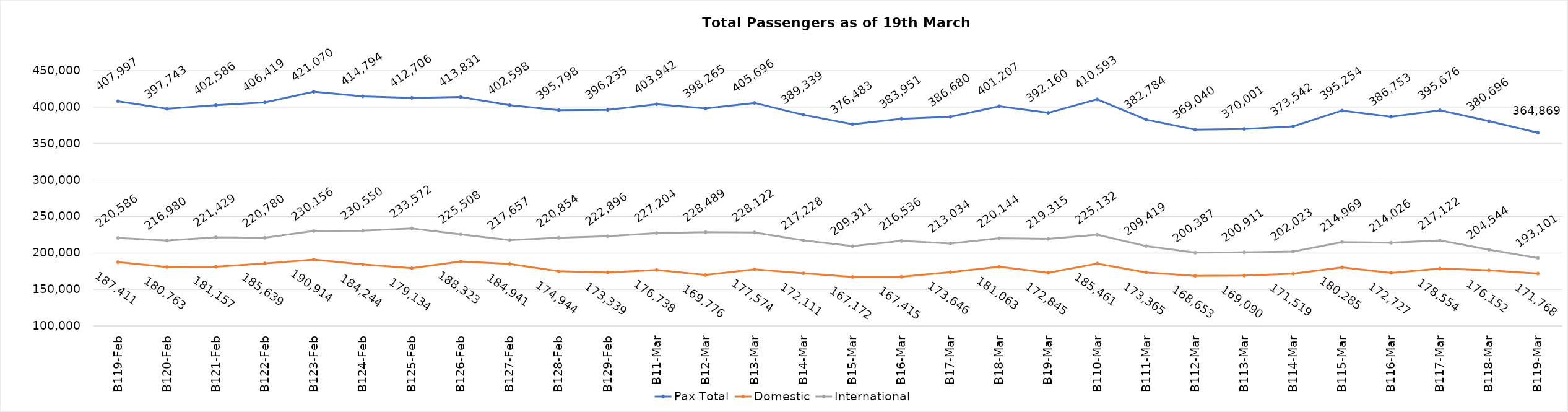
| Category | Pax Total | Domestic | International |
|---|---|---|---|
| 2024-02-19 | 407997 | 187411 | 220586 |
| 2024-02-20 | 397743 | 180763 | 216980 |
| 2024-02-21 | 402586 | 181157 | 221429 |
| 2024-02-22 | 406419 | 185639 | 220780 |
| 2024-02-23 | 421070 | 190914 | 230156 |
| 2024-02-24 | 414794 | 184244 | 230550 |
| 2024-02-25 | 412706 | 179134 | 233572 |
| 2024-02-26 | 413831 | 188323 | 225508 |
| 2024-02-27 | 402598 | 184941 | 217657 |
| 2024-02-28 | 395798 | 174944 | 220854 |
| 2024-02-29 | 396235 | 173339 | 222896 |
| 2024-03-01 | 403942 | 176738 | 227204 |
| 2024-03-02 | 398265 | 169776 | 228489 |
| 2024-03-03 | 405696 | 177574 | 228122 |
| 2024-03-04 | 389339 | 172111 | 217228 |
| 2024-03-05 | 376483 | 167172 | 209311 |
| 2024-03-06 | 383951 | 167415 | 216536 |
| 2024-03-07 | 386680 | 173646 | 213034 |
| 2024-03-08 | 401207 | 181063 | 220144 |
| 2024-03-09 | 392160 | 172845 | 219315 |
| 2024-03-10 | 410593 | 185461 | 225132 |
| 2024-03-11 | 382784 | 173365 | 209419 |
| 2024-03-12 | 369040 | 168653 | 200387 |
| 2024-03-13 | 370001 | 169090 | 200911 |
| 2024-03-14 | 373542 | 171519 | 202023 |
| 2024-03-15 | 395254 | 180285 | 214969 |
| 2024-03-16 | 386753 | 172727 | 214026 |
| 2024-03-17 | 395676 | 178554 | 217122 |
| 2024-03-18 | 380696 | 176152 | 204544 |
| 2024-03-19 | 364869 | 171768 | 193101 |